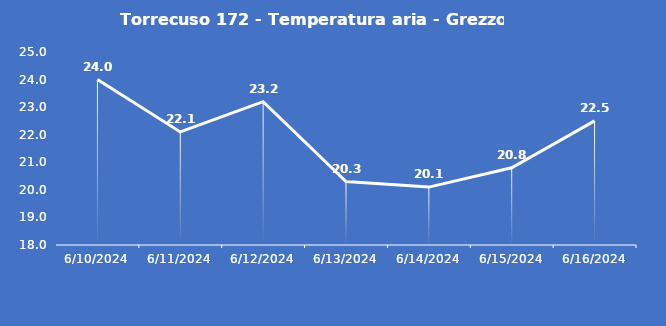
| Category | Torrecuso 172 - Temperatura aria - Grezzo (°C) |
|---|---|
| 6/10/24 | 24 |
| 6/11/24 | 22.1 |
| 6/12/24 | 23.2 |
| 6/13/24 | 20.3 |
| 6/14/24 | 20.1 |
| 6/15/24 | 20.8 |
| 6/16/24 | 22.5 |